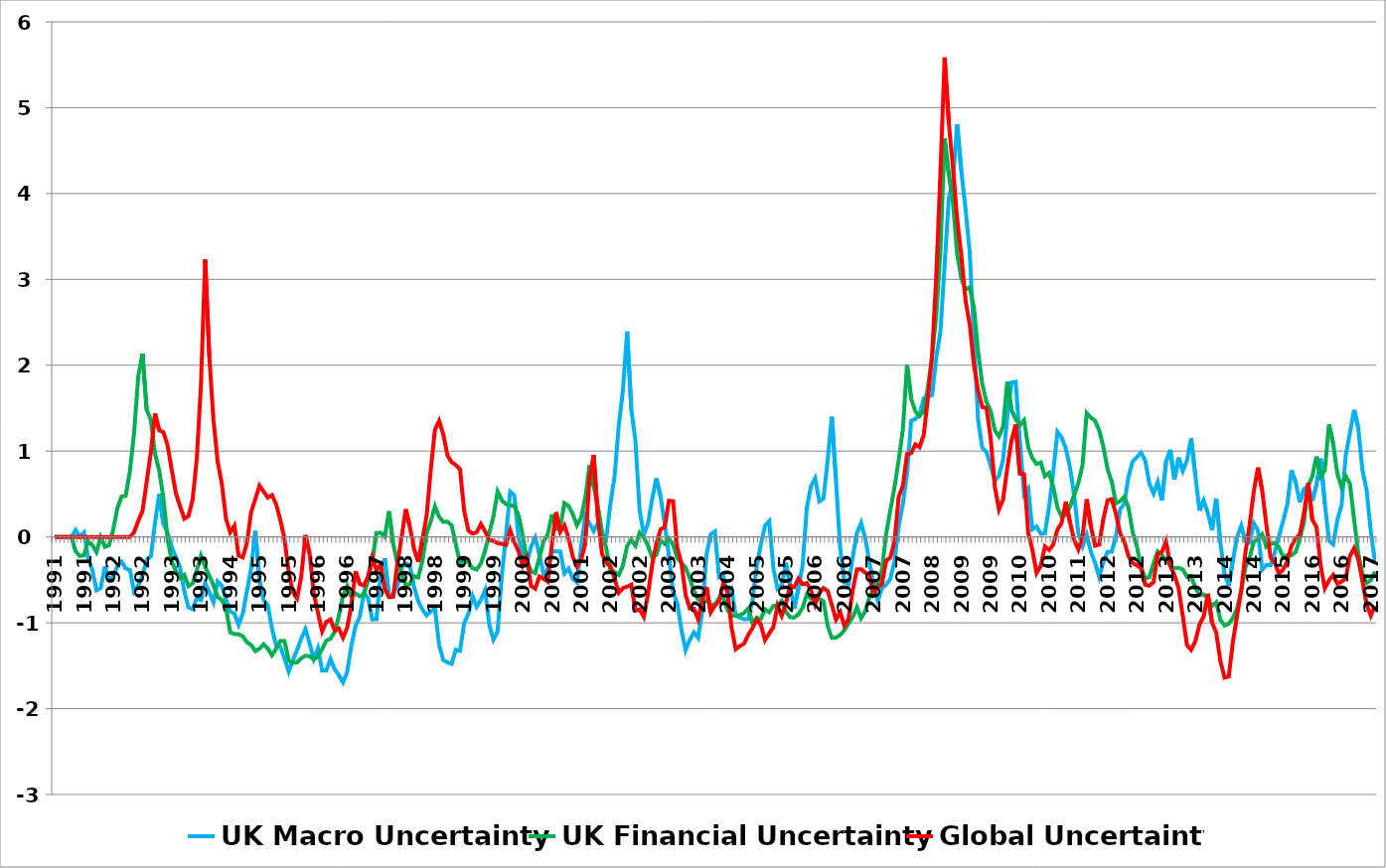
| Category | UK Macro Uncertainty | UK Financial Uncertainty | Global Uncertainty |
|---|---|---|---|
| 1991 | 0 | 0 | 0 |
| 1991 | 0 | 0 | 0 |
| 1991 | 0 | 0 | 0 |
| 1991 | 0 | 0 | 0 |
| 1991 | 0 | 0 | 0 |
| 1991 | 0.08 | -0.168 | 0 |
| 1991 | 0.002 | -0.223 | 0 |
| 1991 | 0.051 | -0.214 | 0 |
| 1991 | -0.249 | -0.05 | 0 |
| 1991 | -0.386 | -0.096 | 0 |
| 1991 | -0.62 | -0.177 | 0 |
| 1991 | -0.595 | -0.003 | 0 |
| 1992 | -0.346 | -0.115 | 0 |
| 1992 | -0.5 | -0.095 | 0 |
| 1992 | -0.466 | 0.085 | 0 |
| 1992 | -0.338 | 0.336 | 0 |
| 1992 | -0.29 | 0.47 | 0 |
| 1992 | -0.367 | 0.481 | 0 |
| 1992 | -0.386 | 0.769 | 0 |
| 1992 | -0.639 | 1.213 | 0.055 |
| 1992 | -0.563 | 1.875 | 0.189 |
| 1992 | -0.448 | 2.134 | 0.301 |
| 1992 | -0.265 | 1.482 | 0.644 |
| 1992 | -0.228 | 1.366 | 0.985 |
| 1993 | 0.164 | 0.965 | 1.437 |
| 1993 | 0.501 | 0.774 | 1.243 |
| 1993 | 0.152 | 0.454 | 1.22 |
| 1993 | 0.052 | -0.014 | 1.07 |
| 1993 | -0.116 | -0.289 | 0.782 |
| 1993 | -0.237 | -0.395 | 0.508 |
| 1993 | -0.356 | -0.479 | 0.357 |
| 1993 | -0.63 | -0.442 | 0.214 |
| 1993 | -0.821 | -0.572 | 0.244 |
| 1993 | -0.839 | -0.541 | 0.434 |
| 1993 | -0.714 | -0.389 | 0.909 |
| 1993 | -0.733 | -0.217 | 1.779 |
| 1994 | -0.538 | -0.347 | 3.233 |
| 1994 | -0.643 | -0.455 | 2.099 |
| 1994 | -0.761 | -0.562 | 1.354 |
| 1994 | -0.518 | -0.699 | 0.874 |
| 1994 | -0.568 | -0.735 | 0.616 |
| 1994 | -0.734 | -0.832 | 0.21 |
| 1994 | -0.867 | -1.111 | 0.053 |
| 1994 | -0.893 | -1.131 | 0.13 |
| 1994 | -1.024 | -1.132 | -0.216 |
| 1994 | -0.893 | -1.157 | -0.239 |
| 1994 | -0.631 | -1.227 | -0.072 |
| 1994 | -0.374 | -1.258 | 0.289 |
| 1995 | 0.073 | -1.33 | 0.44 |
| 1995 | -0.497 | -1.3 | 0.599 |
| 1995 | -0.736 | -1.25 | 0.529 |
| 1995 | -0.795 | -1.3 | 0.458 |
| 1995 | -1.066 | -1.379 | 0.488 |
| 1995 | -1.267 | -1.3 | 0.38 |
| 1995 | -1.28 | -1.211 | 0.196 |
| 1995 | -1.415 | -1.213 | -0.023 |
| 1995 | -1.569 | -1.441 | -0.415 |
| 1995 | -1.437 | -1.466 | -0.641 |
| 1995 | -1.315 | -1.462 | -0.715 |
| 1995 | -1.187 | -1.414 | -0.463 |
| 1996 | -1.074 | -1.384 | 0.022 |
| 1996 | -1.24 | -1.389 | -0.195 |
| 1996 | -1.421 | -1.427 | -0.656 |
| 1996 | -1.296 | -1.391 | -0.885 |
| 1996 | -1.555 | -1.306 | -1.099 |
| 1996 | -1.554 | -1.207 | -0.99 |
| 1996 | -1.42 | -1.185 | -0.961 |
| 1996 | -1.541 | -1.11 | -1.089 |
| 1996 | -1.611 | -0.921 | -1.066 |
| 1996 | -1.693 | -0.682 | -1.174 |
| 1996 | -1.573 | -0.57 | -1.057 |
| 1996 | -1.263 | -0.699 | -0.794 |
| 1997 | -1.036 | -0.658 | -0.401 |
| 1997 | -0.932 | -0.691 | -0.546 |
| 1997 | -0.651 | -0.672 | -0.566 |
| 1997 | -0.712 | -0.499 | -0.46 |
| 1997 | -0.961 | -0.29 | -0.235 |
| 1997 | -0.959 | 0.044 | -0.386 |
| 1997 | -0.445 | 0.049 | -0.322 |
| 1997 | -0.249 | 0.003 | -0.607 |
| 1997 | -0.685 | 0.3 | -0.701 |
| 1997 | -0.671 | -0.074 | -0.696 |
| 1997 | -0.564 | -0.309 | -0.309 |
| 1997 | -0.363 | -0.401 | -0.014 |
| 1998 | -0.309 | -0.562 | 0.324 |
| 1998 | -0.334 | -0.55 | 0.117 |
| 1998 | -0.581 | -0.456 | -0.139 |
| 1998 | -0.75 | -0.472 | -0.291 |
| 1998 | -0.844 | -0.281 | -0.038 |
| 1998 | -0.914 | 0.043 | 0.247 |
| 1998 | -0.868 | 0.18 | 0.782 |
| 1998 | -0.83 | 0.356 | 1.249 |
| 1998 | -1.259 | 0.234 | 1.352 |
| 1998 | -1.436 | 0.174 | 1.194 |
| 1998 | -1.462 | 0.178 | 0.949 |
| 1998 | -1.479 | 0.135 | 0.87 |
| 1999 | -1.313 | -0.087 | 0.839 |
| 1999 | -1.327 | -0.302 | 0.788 |
| 1999 | -1.003 | -0.273 | 0.304 |
| 1999 | -0.896 | -0.296 | 0.075 |
| 1999 | -0.69 | -0.363 | 0.039 |
| 1999 | -0.812 | -0.38 | 0.055 |
| 1999 | -0.731 | -0.309 | 0.15 |
| 1999 | -0.619 | -0.162 | 0.066 |
| 1999 | -1.021 | 0.045 | -0.034 |
| 1999 | -1.196 | 0.238 | -0.045 |
| 1999 | -1.101 | 0.53 | -0.072 |
| 1999 | -0.451 | 0.426 | -0.08 |
| 2000 | 0.013 | 0.382 | -0.092 |
| 2000 | 0.527 | 0.372 | 0.078 |
| 2000 | 0.484 | 0.358 | -0.061 |
| 2000 | -0.001 | 0.254 | -0.167 |
| 2000 | -0.221 | 0.021 | -0.333 |
| 2000 | -0.303 | -0.272 | -0.239 |
| 2000 | -0.115 | -0.398 | -0.57 |
| 2000 | -0.009 | -0.421 | -0.602 |
| 2000 | -0.199 | -0.239 | -0.461 |
| 2000 | -0.433 | -0.051 | -0.488 |
| 2000 | -0.376 | 0.028 | -0.52 |
| 2000 | -0.169 | 0.263 | -0.085 |
| 2001 | -0.166 | 0.092 | 0.289 |
| 2001 | -0.171 | 0.113 | 0.059 |
| 2001 | -0.424 | 0.394 | 0.136 |
| 2001 | -0.368 | 0.36 | -0.015 |
| 2001 | -0.487 | 0.264 | -0.232 |
| 2001 | -0.53 | 0.137 | -0.343 |
| 2001 | -0.105 | 0.227 | -0.264 |
| 2001 | 0.246 | 0.461 | -0.074 |
| 2001 | 0.157 | 0.835 | 0.688 |
| 2001 | 0.068 | 0.59 | 0.953 |
| 2001 | 0.159 | 0.36 | 0.223 |
| 2001 | 0.032 | 0.058 | -0.196 |
| 2002 | -0.018 | -0.131 | -0.306 |
| 2002 | 0.389 | -0.391 | -0.342 |
| 2002 | 0.706 | -0.406 | -0.483 |
| 2002 | 1.295 | -0.444 | -0.65 |
| 2002 | 1.712 | -0.332 | -0.595 |
| 2002 | 2.393 | -0.103 | -0.579 |
| 2002 | 1.487 | -0.033 | -0.556 |
| 2002 | 1.117 | -0.103 | -0.859 |
| 2002 | 0.302 | 0.05 | -0.845 |
| 2002 | 0.028 | -0.005 | -0.931 |
| 2002 | 0.158 | -0.102 | -0.663 |
| 2002 | 0.442 | -0.238 | -0.323 |
| 2003 | 0.682 | -0.207 | -0.076 |
| 2003 | 0.472 | -0.042 | 0.087 |
| 2003 | 0.154 | -0.08 | 0.116 |
| 2003 | -0.22 | -0.018 | 0.422 |
| 2003 | -0.637 | -0.089 | 0.417 |
| 2003 | -0.771 | -0.242 | -0.125 |
| 2003 | -1.08 | -0.302 | -0.305 |
| 2003 | -1.317 | -0.358 | -0.674 |
| 2003 | -1.197 | -0.48 | -0.834 |
| 2003 | -1.11 | -0.631 | -0.835 |
| 2003 | -1.176 | -0.726 | -0.96 |
| 2003 | -0.864 | -0.757 | -0.732 |
| 2004 | -0.204 | -0.738 | -0.583 |
| 2004 | 0.03 | -0.794 | -0.879 |
| 2004 | 0.063 | -0.785 | -0.799 |
| 2004 | -0.468 | -0.717 | -0.753 |
| 2004 | -0.447 | -0.701 | -0.542 |
| 2004 | -0.665 | -0.848 | -0.625 |
| 2004 | -0.607 | -0.914 | -1.055 |
| 2004 | -0.917 | -0.921 | -1.308 |
| 2004 | -0.939 | -0.911 | -1.269 |
| 2004 | -0.96 | -0.885 | -1.243 |
| 2004 | -0.955 | -0.833 | -1.14 |
| 2004 | -0.737 | -1.005 | -1.063 |
| 2005 | -0.353 | -0.942 | -0.962 |
| 2005 | -0.089 | -0.955 | -1.022 |
| 2005 | 0.13 | -0.842 | -1.201 |
| 2005 | 0.186 | -0.876 | -1.125 |
| 2005 | -0.362 | -0.803 | -1.05 |
| 2005 | -0.603 | -0.794 | -0.802 |
| 2005 | -0.562 | -0.747 | -0.919 |
| 2005 | -0.301 | -0.872 | -0.777 |
| 2005 | -0.562 | -0.935 | -0.569 |
| 2005 | -0.838 | -0.938 | -0.583 |
| 2005 | -0.596 | -0.902 | -0.484 |
| 2005 | -0.333 | -0.824 | -0.549 |
| 2006 | 0.336 | -0.672 | -0.538 |
| 2006 | 0.59 | -0.719 | -0.617 |
| 2006 | 0.683 | -0.707 | -0.788 |
| 2006 | 0.415 | -0.722 | -0.653 |
| 2006 | 0.445 | -0.747 | -0.596 |
| 2006 | 0.895 | -1.036 | -0.63 |
| 2006 | 1.399 | -1.176 | -0.793 |
| 2006 | 0.65 | -1.172 | -0.961 |
| 2006 | -0.132 | -1.142 | -0.874 |
| 2006 | -0.527 | -1.087 | -1.036 |
| 2006 | -0.548 | -1.007 | -0.951 |
| 2006 | -0.237 | -0.934 | -0.621 |
| 2007 | 0.044 | -0.818 | -0.379 |
| 2007 | 0.162 | -0.947 | -0.375 |
| 2007 | -0.011 | -0.864 | -0.416 |
| 2007 | -0.3 | -0.7 | -0.446 |
| 2007 | -0.565 | -0.594 | -0.663 |
| 2007 | -0.74 | -0.544 | -0.581 |
| 2007 | -0.595 | -0.382 | -0.549 |
| 2007 | -0.553 | 0.033 | -0.277 |
| 2007 | -0.489 | 0.309 | -0.24 |
| 2007 | -0.284 | 0.579 | -0.052 |
| 2007 | 0.122 | 0.894 | 0.468 |
| 2007 | 0.388 | 1.251 | 0.594 |
| 2008 | 0.735 | 2.002 | 0.965 |
| 2008 | 1.353 | 1.61 | 0.976 |
| 2008 | 1.375 | 1.462 | 1.078 |
| 2008 | 1.433 | 1.407 | 1.045 |
| 2008 | 1.615 | 1.461 | 1.19 |
| 2008 | 1.634 | 1.748 | 1.622 |
| 2008 | 1.653 | 2.105 | 2.123 |
| 2008 | 2.093 | 2.584 | 3.05 |
| 2008 | 2.396 | 3.353 | 4.259 |
| 2008 | 3.177 | 4.642 | 5.586 |
| 2008 | 3.943 | 4.22 | 4.822 |
| 2008 | 4.161 | 3.889 | 4.296 |
| 2009 | 4.808 | 3.289 | 3.695 |
| 2009 | 4.255 | 3.011 | 3.273 |
| 2009 | 3.821 | 2.883 | 2.753 |
| 2009 | 3.316 | 2.909 | 2.474 |
| 2009 | 2.327 | 2.674 | 2.013 |
| 2009 | 1.367 | 2.164 | 1.708 |
| 2009 | 1.039 | 1.781 | 1.514 |
| 2009 | 0.99 | 1.572 | 1.504 |
| 2009 | 0.832 | 1.473 | 1.16 |
| 2009 | 0.654 | 1.242 | 0.589 |
| 2009 | 0.713 | 1.17 | 0.319 |
| 2009 | 0.9 | 1.289 | 0.443 |
| 2010 | 1.401 | 1.808 | 0.806 |
| 2010 | 1.798 | 1.479 | 1.124 |
| 2010 | 1.807 | 1.375 | 1.309 |
| 2010 | 1.125 | 1.298 | 0.737 |
| 2010 | 0.498 | 1.359 | 0.731 |
| 2010 | 0.566 | 1.047 | 0.048 |
| 2010 | 0.09 | 0.918 | -0.149 |
| 2010 | 0.122 | 0.85 | -0.418 |
| 2010 | 0.038 | 0.868 | -0.336 |
| 2010 | 0.042 | 0.707 | -0.111 |
| 2010 | 0.35 | 0.747 | -0.153 |
| 2010 | 0.756 | 0.585 | -0.089 |
| 2011 | 1.224 | 0.343 | 0.086 |
| 2011 | 1.158 | 0.239 | 0.162 |
| 2011 | 1.029 | 0.259 | 0.41 |
| 2011 | 0.811 | 0.351 | 0.171 |
| 2011 | 0.49 | 0.488 | -0.032 |
| 2011 | 0.045 | 0.627 | -0.145 |
| 2011 | -0.109 | 0.837 | 0.004 |
| 2011 | 0.025 | 1.442 | 0.439 |
| 2011 | -0.171 | 1.389 | 0.123 |
| 2011 | -0.3 | 1.353 | -0.102 |
| 2011 | -0.465 | 1.239 | -0.089 |
| 2011 | -0.288 | 1.05 | 0.214 |
| 2012 | -0.175 | 0.788 | 0.426 |
| 2012 | -0.172 | 0.644 | 0.44 |
| 2012 | 0.008 | 0.391 | 0.268 |
| 2012 | 0.321 | 0.417 | 0.042 |
| 2012 | 0.387 | 0.468 | -0.052 |
| 2012 | 0.703 | 0.344 | -0.223 |
| 2012 | 0.878 | 0.056 | -0.302 |
| 2012 | 0.93 | -0.109 | -0.332 |
| 2012 | 0.983 | -0.344 | -0.364 |
| 2012 | 0.891 | -0.484 | -0.556 |
| 2012 | 0.623 | -0.467 | -0.568 |
| 2012 | 0.507 | -0.308 | -0.528 |
| 2013 | 0.641 | -0.17 | -0.2 |
| 2013 | 0.425 | -0.211 | -0.175 |
| 2013 | 0.876 | -0.265 | -0.051 |
| 2013 | 1.016 | -0.332 | -0.338 |
| 2013 | 0.669 | -0.366 | -0.443 |
| 2013 | 0.925 | -0.359 | -0.596 |
| 2013 | 0.769 | -0.38 | -0.921 |
| 2013 | 0.891 | -0.464 | -1.258 |
| 2013 | 1.149 | -0.454 | -1.316 |
| 2013 | 0.721 | -0.589 | -1.215 |
| 2013 | 0.307 | -0.677 | -1.021 |
| 2013 | 0.426 | -0.669 | -0.925 |
| 2014 | 0.279 | -0.719 | -0.662 |
| 2014 | 0.078 | -0.803 | -0.999 |
| 2014 | 0.447 | -0.761 | -1.111 |
| 2014 | -0.067 | -0.964 | -1.446 |
| 2014 | -0.428 | -1.032 | -1.639 |
| 2014 | -0.567 | -1.011 | -1.625 |
| 2014 | -0.268 | -0.944 | -1.22 |
| 2014 | -0.002 | -0.836 | -0.916 |
| 2014 | 0.132 | -0.617 | -0.623 |
| 2014 | -0.051 | -0.352 | -0.177 |
| 2014 | -0.067 | -0.243 | 0.143 |
| 2014 | 0.161 | -0.056 | 0.535 |
| 2015 | 0.074 | -0.025 | 0.809 |
| 2015 | -0.381 | 0.031 | 0.542 |
| 2015 | -0.328 | -0.116 | 0.144 |
| 2015 | -0.328 | -0.082 | -0.237 |
| 2015 | -0.18 | -0.07 | -0.303 |
| 2015 | 0.003 | -0.12 | -0.425 |
| 2015 | 0.184 | -0.228 | -0.383 |
| 2015 | 0.372 | -0.212 | -0.284 |
| 2015 | 0.777 | -0.213 | -0.105 |
| 2015 | 0.639 | -0.176 | -0.02 |
| 2015 | 0.406 | -0.029 | 0.029 |
| 2015 | 0.558 | 0.175 | 0.273 |
| 2016 | 0.597 | 0.594 | 0.626 |
| 2016 | 0.42 | 0.709 | 0.201 |
| 2016 | 0.609 | 0.936 | 0.117 |
| 2016 | 0.915 | 0.704 | -0.336 |
| 2016 | 0.387 | 0.776 | -0.599 |
| 2016 | -0.044 | 1.31 | -0.506 |
| 2016 | -0.086 | 1.087 | -0.443 |
| 2016 | 0.195 | 0.738 | -0.544 |
| 2016 | 0.372 | 0.579 | -0.519 |
| 2016 | 0.948 | 0.708 | -0.484 |
| 2016 | 1.21 | 0.621 | -0.222 |
| 2016 | 1.48 | 0.204 | -0.132 |
| 2017 | 1.272 | -0.187 | -0.258 |
| 2017 | 0.778 | -0.427 | -0.516 |
| 2017 | 0.545 | -0.537 | -0.786 |
| 2017 | 0.065 | -0.503 | -0.917 |
| 2017 | -0.291 | -0.404 | -0.801 |